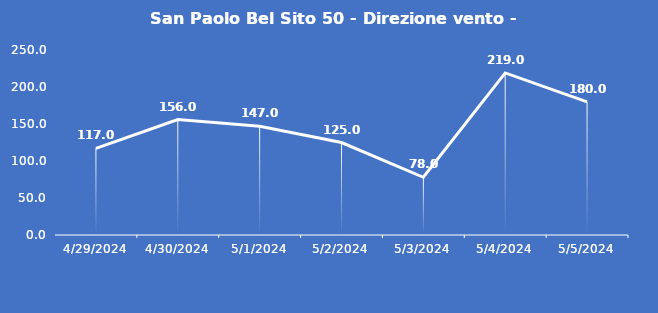
| Category | San Paolo Bel Sito 50 - Direzione vento - Grezzo (°N) |
|---|---|
| 4/29/24 | 117 |
| 4/30/24 | 156 |
| 5/1/24 | 147 |
| 5/2/24 | 125 |
| 5/3/24 | 78 |
| 5/4/24 | 219 |
| 5/5/24 | 180 |